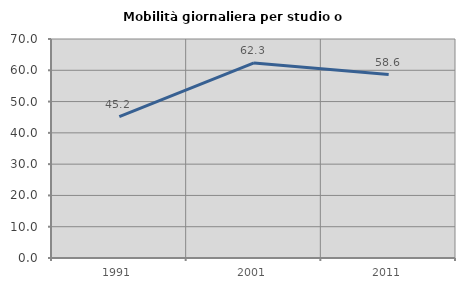
| Category | Mobilità giornaliera per studio o lavoro |
|---|---|
| 1991.0 | 45.221 |
| 2001.0 | 62.338 |
| 2011.0 | 58.621 |